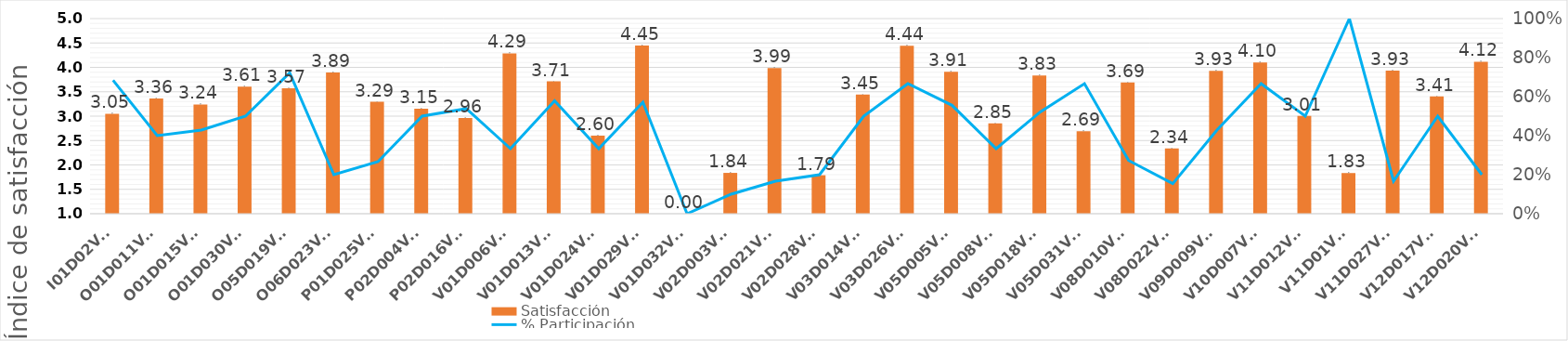
| Category | Satisfacción |
|---|---|
| I01D02V06 | 3.049 |
| O01D011V06 | 3.364 |
| O01D015V06 | 3.239 |
| O01D030V06 | 3.605 |
| O05D019V06 | 3.574 |
| O06D023V06 | 3.893 |
| P01D025V06 | 3.293 |
| P02D004V06 | 3.154 |
| P02D016V06 | 2.963 |
| V01D006V06 | 4.288 |
| V01D013V06 | 3.714 |
| V01D024V06 | 2.598 |
| V01D029V06 | 4.448 |
| V01D032V06 | 0 |
| V02D003V06 | 1.837 |
| V02D021V06 | 3.988 |
| V02D028V06 | 1.789 |
| V03D014V06 | 3.445 |
| V03D026V06 | 4.442 |
| V05D005V06 | 3.912 |
| V05D008V06 | 2.853 |
| V05D018V06 | 3.834 |
| V05D031V06 | 2.69 |
| V08D010V06 | 3.691 |
| V08D022V06 | 2.336 |
| V09D009V06 | 3.927 |
| V10D007V06 | 4.098 |
| V11D012V06 | 3.005 |
| V11D01V06 | 1.834 |
| V11D027V06 | 3.932 |
| V12D017V06 | 3.406 |
| V12D020V06 | 4.115 |